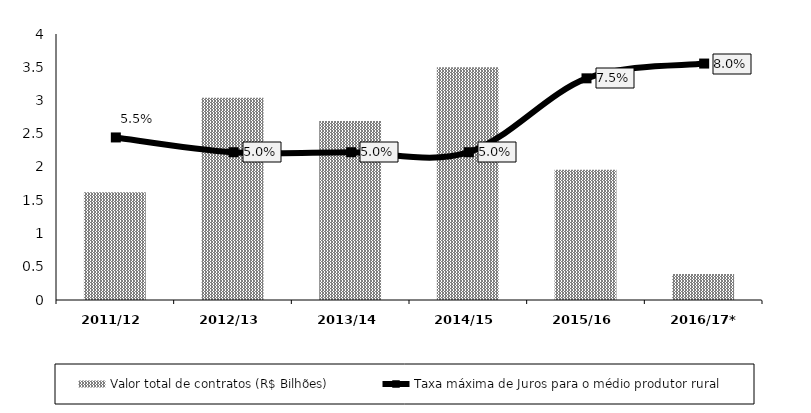
| Category | Valor total de contratos (R$ Bilhões) |
|---|---|
| 2011/12 | 1.62 |
| 2012/13 | 3.04 |
| 2013/14 | 2.69 |
| 2014/15 | 3.5 |
| 2015/16 | 1.96 |
| 2016/17* | 0.39 |